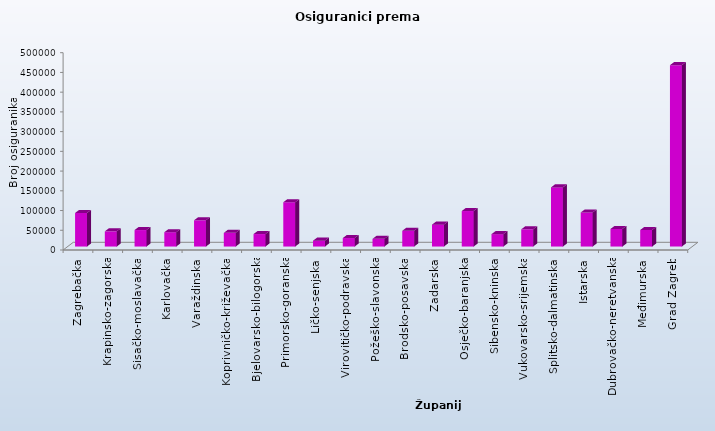
| Category | Series 0 |
|---|---|
| Zagrebačka | 85025 |
| Krapinsko-zagorska | 38528 |
| Sisačko-moslavačka | 41778 |
| Karlovačka | 36327 |
| Varaždinska | 66473 |
| Koprivničko-križevačka | 34729 |
| Bjelovarsko-bilogorska | 31641 |
| Primorsko-goranska | 112253 |
| Ličko-senjska | 14874 |
| Virovitičko-podravska | 21544 |
| Požeško-slavonska | 19558 |
| Brodsko-posavska | 39956 |
| Zadarska | 55464 |
| Osječko-baranjska | 89992 |
| Šibensko-kninska | 31410 |
| Vukovarsko-srijemska | 43661 |
| Splitsko-dalmatinska | 149919 |
| Istarska | 86293 |
| Dubrovačko-neretvanska | 44538 |
| Međimurska | 41956 |
| Grad Zagreb | 459647 |